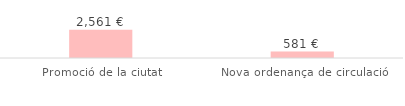
| Category | Total |
|---|---|
| Promoció de la ciutat | 2561.31 |
| Nova ordenança de circulació | 580.8 |